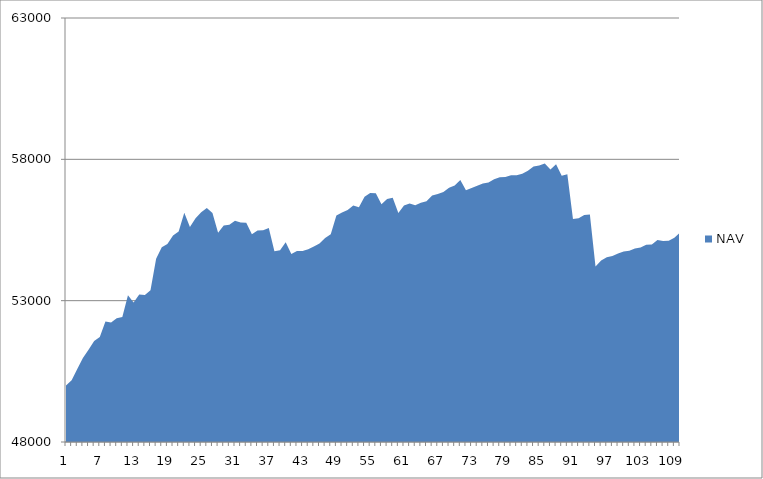
| Category | NAV |
|---|---|
| 0 | 50000 |
| 1 | 50185.185 |
| 2 | 50585.185 |
| 3 | 50973.977 |
| 4 | 51265.977 |
| 5 | 51576.741 |
| 6 | 51711.523 |
| 7 | 52262.893 |
| 8 | 52230.24 |
| 9 | 52381.556 |
| 10 | 52425.915 |
| 11 | 53192.581 |
| 12 | 52939.146 |
| 13 | 53220.069 |
| 14 | 53197.341 |
| 15 | 53369.61 |
| 16 | 54480.721 |
| 17 | 54888.365 |
| 18 | 55001.902 |
| 19 | 55308.308 |
| 20 | 55448.308 |
| 21 | 56110.305 |
| 22 | 55610.305 |
| 23 | 55916.954 |
| 24 | 56129.798 |
| 25 | 56279.798 |
| 26 | 56105.301 |
| 27 | 55401.645 |
| 28 | 55657.201 |
| 29 | 55686.925 |
| 30 | 55823.001 |
| 31 | 55769.596 |
| 32 | 55759.375 |
| 33 | 55350.284 |
| 34 | 55480.284 |
| 35 | 55492.498 |
| 36 | 55570.42 |
| 37 | 54746.89 |
| 38 | 54783.7 |
| 39 | 55066.459 |
| 40 | 54651.074 |
| 41 | 54754.078 |
| 42 | 54760.213 |
| 43 | 54816.924 |
| 44 | 54917.296 |
| 45 | 55025.73 |
| 46 | 55220.535 |
| 47 | 55353.465 |
| 48 | 56009.309 |
| 49 | 56118.959 |
| 50 | 56205.212 |
| 51 | 56362.876 |
| 52 | 56307.394 |
| 53 | 56678.935 |
| 54 | 56813.264 |
| 55 | 56799.502 |
| 56 | 56409.112 |
| 57 | 56596.44 |
| 58 | 56640.493 |
| 59 | 56102.227 |
| 60 | 56370.449 |
| 61 | 56434.248 |
| 62 | 56376.841 |
| 63 | 56464.524 |
| 64 | 56518.022 |
| 65 | 56724.747 |
| 66 | 56770.361 |
| 67 | 56848.099 |
| 68 | 56992.896 |
| 69 | 57073.571 |
| 70 | 57266.481 |
| 71 | 56908.016 |
| 72 | 56984.939 |
| 73 | 57069.276 |
| 74 | 57147.627 |
| 75 | 57179.83 |
| 76 | 57291.17 |
| 77 | 57366.35 |
| 78 | 57371.599 |
| 79 | 57439.215 |
| 80 | 57440.895 |
| 81 | 57490.895 |
| 82 | 57593.679 |
| 83 | 57746.643 |
| 84 | 57785.413 |
| 85 | 57849.748 |
| 86 | 57639.346 |
| 87 | 57828.82 |
| 88 | 57417.055 |
| 89 | 57471.335 |
| 90 | 55888.376 |
| 91 | 55913.907 |
| 92 | 56031.989 |
| 93 | 56044.711 |
| 94 | 54210.631 |
| 95 | 54422.612 |
| 96 | 54536.647 |
| 97 | 54575.903 |
| 98 | 54670.229 |
| 99 | 54737.367 |
| 100 | 54762.386 |
| 101 | 54842.923 |
| 102 | 54881.385 |
| 103 | 54978.816 |
| 104 | 54991.283 |
| 105 | 55149.699 |
| 106 | 55109.498 |
| 107 | 55121.656 |
| 108 | 55227.569 |
| 109 | 55405.15 |